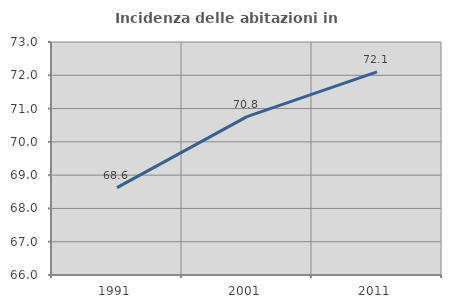
| Category | Incidenza delle abitazioni in proprietà  |
|---|---|
| 1991.0 | 68.625 |
| 2001.0 | 70.757 |
| 2011.0 | 72.103 |